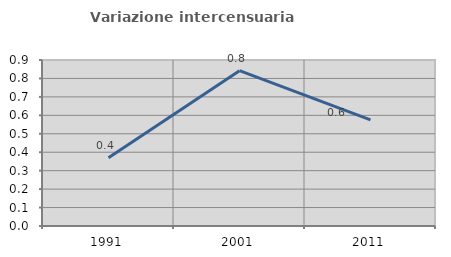
| Category | Variazione intercensuaria annua |
|---|---|
| 1991.0 | 0.37 |
| 2001.0 | 0.842 |
| 2011.0 | 0.576 |